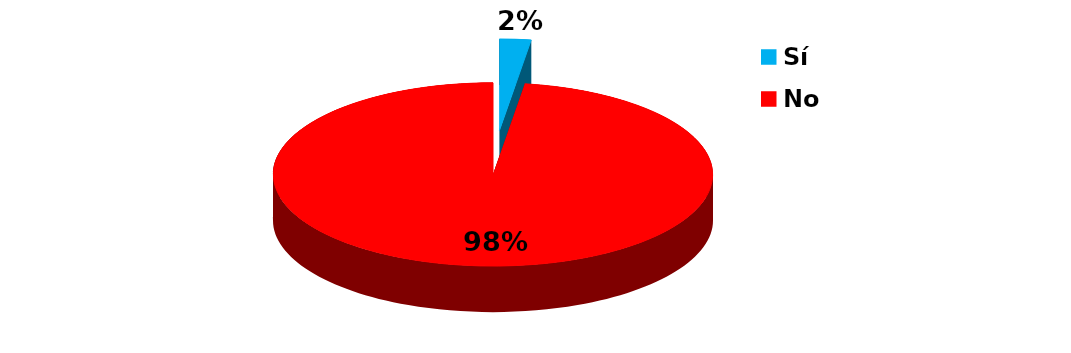
| Category | Series 0 |
|---|---|
| Sí | 3 |
| No | 127 |